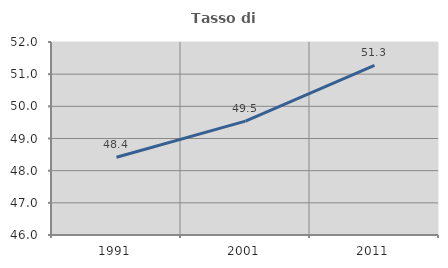
| Category | Tasso di occupazione   |
|---|---|
| 1991.0 | 48.418 |
| 2001.0 | 49.54 |
| 2011.0 | 51.272 |